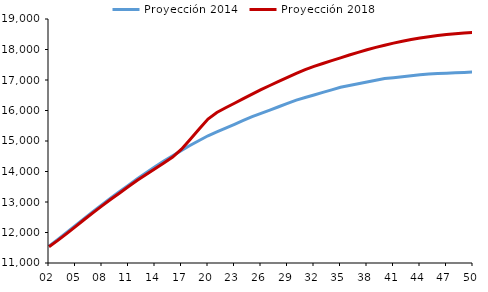
| Category | Proyección 2014 | Proyección 2018 |
|---|---|---|
| 02 | 11552.285 | 11534.889 |
| 03 | 11776.248 | 11740.789 |
| 04 | 12002.97 | 11964.504 |
| 05 | 12232.813 | 12192.013 |
| 06 | 12463.452 | 12426.369 |
| 07 | 12690.326 | 12653.605 |
| 08 | 12913.2 | 12874.671 |
| 09 | 13132.861 | 13088.819 |
| 10 | 13344.647 | 13296.16 |
| 11 | 13553.161 | 13505.226 |
| 12 | 13759.865 | 13711.386 |
| 13 | 13959.92 | 13899.476 |
| 14 | 14153.468 | 14088.688 |
| 15 | 14339.915 | 14275.667 |
| 16 | 14518.969 | 14474.396 |
| 17 | 14692.894 | 14729.49 |
| 18 | 14858.432 | 15055.265 |
| 19 | 15017.35 | 15393.044 |
| 20 | 15171.68 | 15720.272 |
| 21 | 15296.973 | 15932.698 |
| 22 | 15422.265 | 16089.197 |
| 23 | 15547.558 | 16238.022 |
| 24 | 15672.85 | 16388.352 |
| 25 | 15798.143 | 16537.166 |
| 26 | 15906.727 | 16681.983 |
| 27 | 16015.311 | 16819.953 |
| 28 | 16123.895 | 16951.764 |
| 29 | 16232.479 | 17082.254 |
| 30 | 16341.063 | 17214.144 |
| 31 | 16425.11 | 17337.645 |
| 32 | 16509.158 | 17444.768 |
| 33 | 16593.205 | 17541.465 |
| 34 | 16677.252 | 17634.719 |
| 35 | 16761.3 | 17727.344 |
| 36 | 16818.373 | 17818.51 |
| 37 | 16875.446 | 17906.351 |
| 38 | 16932.519 | 17989.805 |
| 39 | 16989.591 | 18068.363 |
| 40 | 17046.664 | 18141.636 |
| 41 | 17077.197 | 18209.31 |
| 42 | 17107.73 | 18271.124 |
| 43 | 17138.263 | 18326.894 |
| 44 | 17168.796 | 18376.489 |
| 45 | 17199.329 | 18419.812 |
| 46 | 17211.746 | 18458.571 |
| 47 | 17224.163 | 18491.612 |
| 48 | 17236.58 | 18518.989 |
| 49 | 17248.998 | 18540.811 |
| 50 | 17261.415 | 18557.223 |